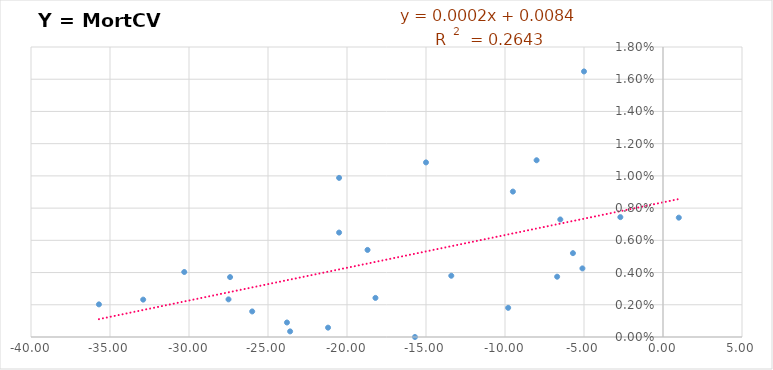
| Category | Y = MortCV /año |
|---|---|
| -30.30000000000001 | 0.004 |
| -15.0 | 0.011 |
| -8.0 | 0.011 |
| -6.699999999999989 | 0.004 |
| -35.69999999999999 | 0.002 |
| -18.69999999999999 | 0.005 |
| -32.900000000000006 | 0.002 |
| -20.5 | 0.01 |
| -23.599999999999994 | 0 |
| -23.80000000000001 | 0.001 |
| -20.5 | 0.006 |
| -18.19999999999999 | 0.002 |
| -15.699999999999989 | 0 |
| -27.400000000000006 | 0.004 |
| -5.0 | 0.016 |
| 1.0 | 0.007 |
| -2.6999999999999886 | 0.007 |
| -26.0 | 0.002 |
| -5.699999999999989 | 0.005 |
| -27.5 | 0.002 |
| -9.5 | 0.009 |
| -21.19999999999999 | 0.001 |
| -9.800000000000011 | 0.002 |
| -6.5 | 0.007 |
| -5.099999999999994 | 0.004 |
| -13.400000000000006 | 0.004 |